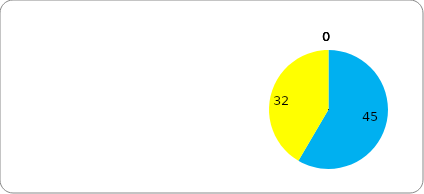
| Category | Series 0 |
|---|---|
| outstanding | 45 |
| good | 32 |
| requires improvement | 0 |
| inadequate | 0 |
| not yet inspected | 0 |
| not inspected by Ofsted | 0 |